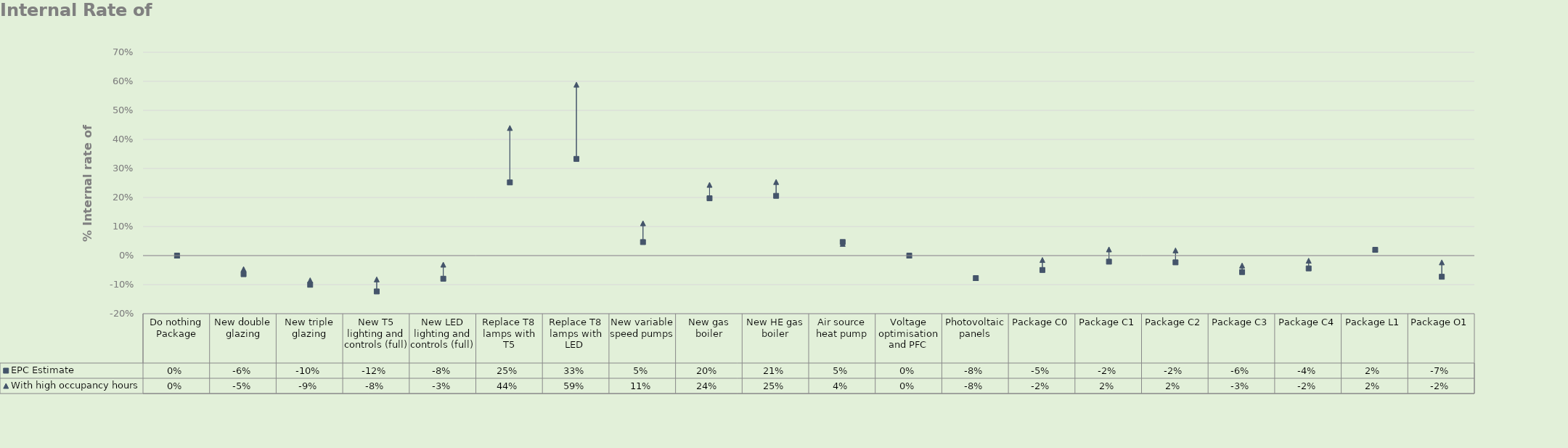
| Category | EPC Estimate | With high occupancy hours |
|---|---|---|
| Do nothing Package | 0 | 0 |
| New double glazing | -0.064 | -0.047 |
| New triple glazing | -0.1 | -0.085 |
| New T5 lighting and controls (full) | -0.124 | -0.082 |
| New LED lighting and controls (full) | -0.08 | -0.031 |
| Replace T8 lamps with T5 | 0.252 | 0.439 |
| Replace T8 lamps with LED  | 0.333 | 0.588 |
| New variable speed pumps | 0.046 | 0.111 |
| New gas boiler | 0.197 | 0.244 |
| New HE gas boiler | 0.206 | 0.253 |
| Air source heat pump | 0.047 | 0.04 |
| Voltage optimisation and PFC | 0 | 0 |
| Photovoltaic panels | -0.078 | -0.078 |
| Package C0 | -0.05 | -0.015 |
| Package C1 | -0.021 | 0.021 |
| Package C2 | -0.023 | 0.018 |
| Package C3 | -0.057 | -0.034 |
| Package C4 | -0.044 | -0.018 |
| Package L1 | 0.02 | 0.021 |
| Package O1 | -0.073 | -0.023 |